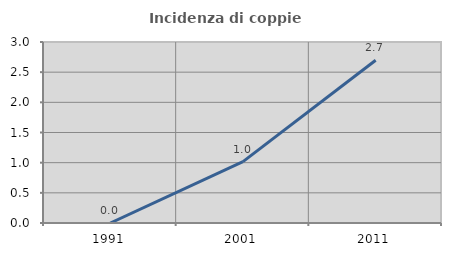
| Category | Incidenza di coppie miste |
|---|---|
| 1991.0 | 0 |
| 2001.0 | 1.018 |
| 2011.0 | 2.697 |